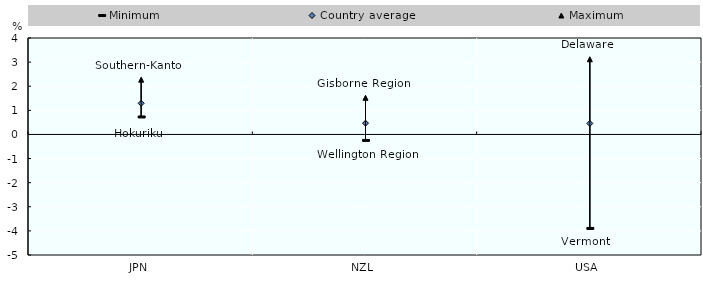
| Category | Minimum  | Country average | Maximum |
|---|---|---|---|
| JPN | 0.725 | 1.291 | 2.272 |
| NZL | -0.248 | 0.467 | 1.519 |
| USA | -3.898 | 0.456 | 3.118 |